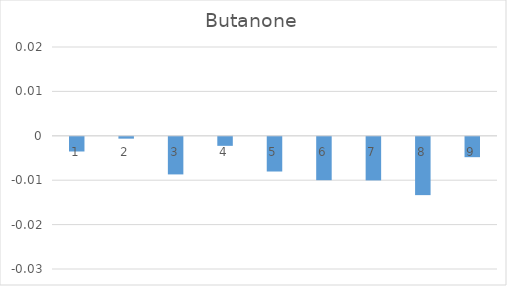
| Category | Series 0 |
|---|---|
| 0 | -0.003 |
| 1 | 0 |
| 2 | -0.008 |
| 3 | -0.002 |
| 4 | -0.008 |
| 5 | -0.01 |
| 6 | -0.01 |
| 7 | -0.013 |
| 8 | -0.005 |